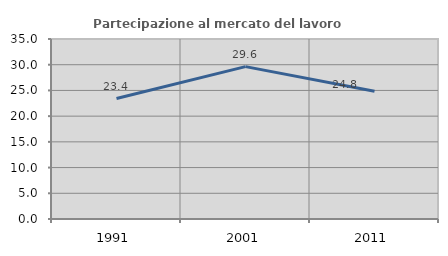
| Category | Partecipazione al mercato del lavoro  femminile |
|---|---|
| 1991.0 | 23.415 |
| 2001.0 | 29.628 |
| 2011.0 | 24.847 |